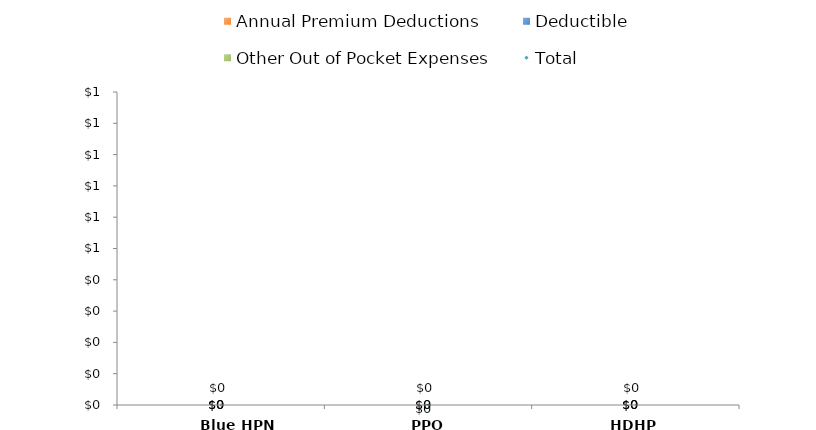
| Category | Annual Premium Deductions | Deductible | Other Out of Pocket Expenses |
|---|---|---|---|
| Blue HPN | 0 | 0 | 0 |
| PPO 80/20 | 0 | 0 | 0 |
| HDHP | 0 | 0 | 0 |